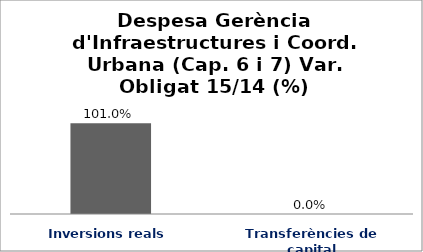
| Category | Series 0 |
|---|---|
| Inversions reals | 1.01 |
| Transferències de capital | 0 |